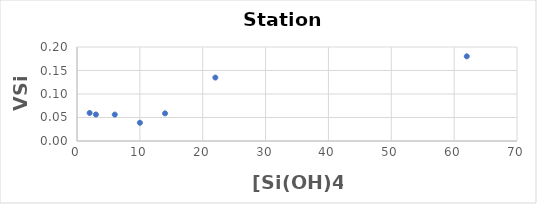
| Category | Series 0 |
|---|---|
| 2.01 | 0.06 |
| 3.01 | 0.056 |
| 6.01 | 0.056 |
| 10.01 | 0.039 |
| 14.01 | 0.059 |
| 22.009999999999998 | 0.135 |
| 62.01 | 0.18 |